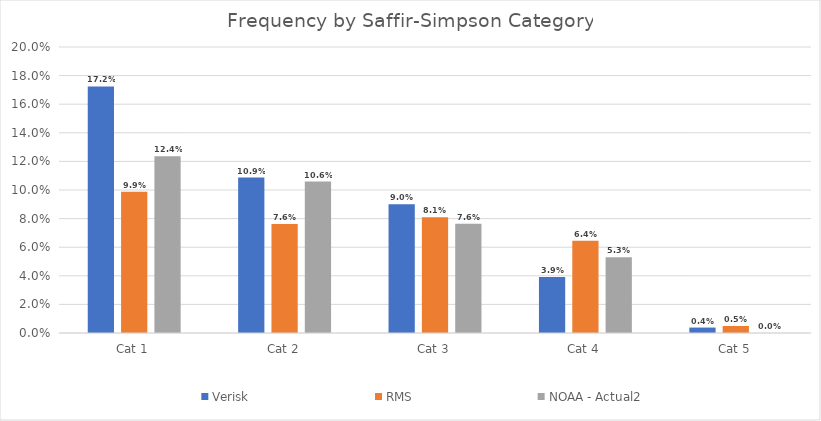
| Category | Verisk | RMS | NOAA - Actual2 |
|---|---|---|---|
| Cat 1 | 0.172 | 0.099 | 0.124 |
| Cat 2 | 0.109 | 0.076 | 0.106 |
| Cat 3 | 0.09 | 0.081 | 0.076 |
| Cat 4 | 0.039 | 0.064 | 0.053 |
| Cat 5 | 0.004 | 0.005 | 0 |